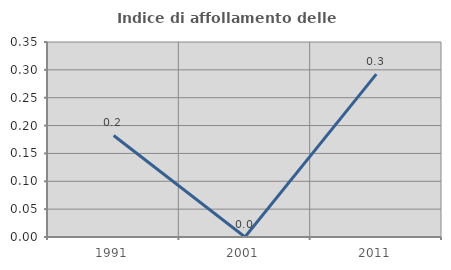
| Category | Indice di affollamento delle abitazioni  |
|---|---|
| 1991.0 | 0.182 |
| 2001.0 | 0 |
| 2011.0 | 0.292 |